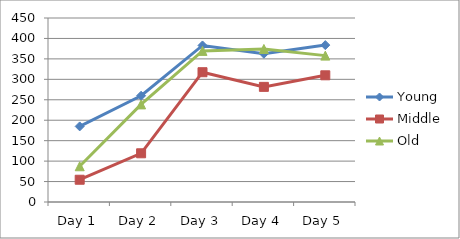
| Category | Young | Middle | Old |
|---|---|---|---|
| Day 1 | 184.857 | 54.429 | 87.429 |
| Day 2 | 259.857 | 119.143 | 238.714 |
| Day 3 | 382.857 | 317.429 | 369.571 |
| Day 4 | 362.571 | 281.571 | 374.286 |
| Day 5 | 383.714 | 309.857 | 358 |